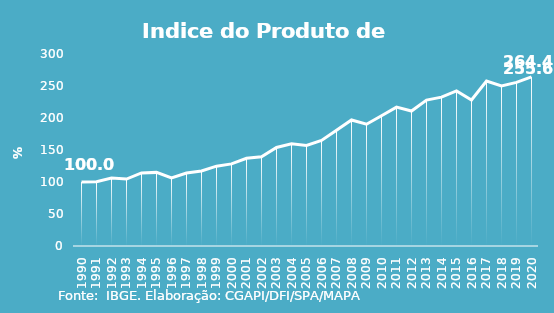
| Category | Indice de Prod. base 1990 |
|---|---|
| 1990.0 | 100 |
| 1991.0 | 100.275 |
| 1992.0 | 106.203 |
| 1993.0 | 104.57 |
| 1994.0 | 114.164 |
| 1995.0 | 115.024 |
| 1996.0 | 106.552 |
| 1997.0 | 114.037 |
| 1998.0 | 117.319 |
| 1999.0 | 124.734 |
| 2000.0 | 128.293 |
| 2001.0 | 136.975 |
| 2002.0 | 139.51 |
| 2003.0 | 153.868 |
| 2004.0 | 159.641 |
| 2005.0 | 157.136 |
| 2006.0 | 164.858 |
| 2007.0 | 180.781 |
| 2008.0 | 196.91 |
| 2009.0 | 190.309 |
| 2010.0 | 203.581 |
| 2011.0 | 217.041 |
| 2012.0 | 210.932 |
| 2013.0 | 228.009 |
| 2014.0 | 232.562 |
| 2015.0 | 242.318 |
| 2016.0 | 228.239 |
| 2017.0 | 257.766 |
| 2018.0 | 250.124 |
| 2019.0 | 255.64 |
| 2020.0 | 264.388 |